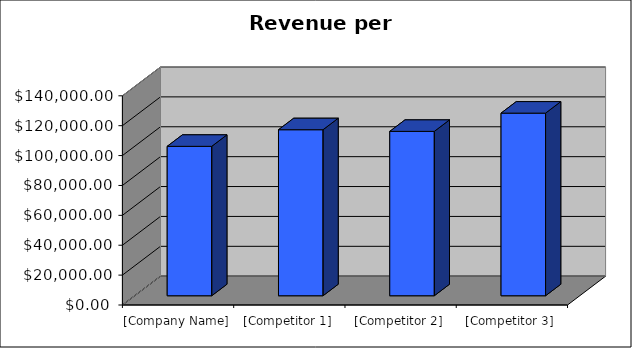
| Category | Series 24 |
|---|---|
| [Company Name] | 100000 |
| [Competitor 1] | 111111.111 |
| [Competitor 2] | 110000 |
| [Competitor 3] | 122222.222 |